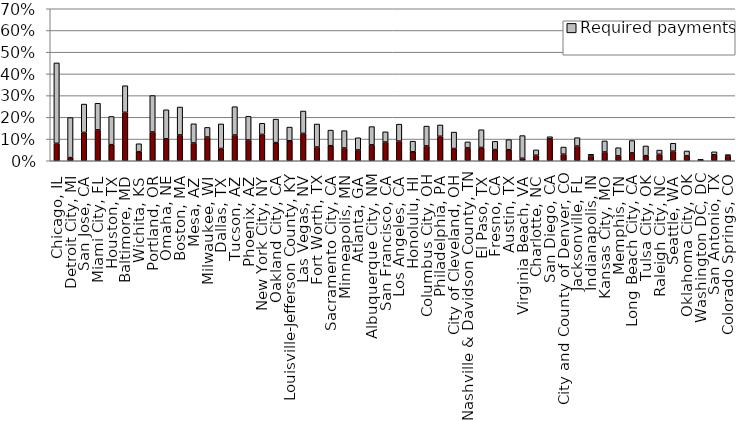
| Category | Current payments | Required payments |
|---|---|---|
| Chicago, IL | 0.08 | 0.371 |
| Detroit City, MI | 0.015 | 0.184 |
| San Jose, CA | 0.13 | 0.131 |
| Miami City, FL | 0.142 | 0.123 |
| Houston, TX | 0.074 | 0.13 |
| Baltimore, MD | 0.223 | 0.123 |
| Wichita, KS | 0.042 | 0.036 |
| Portland, OR | 0.132 | 0.168 |
| Omaha, NE | 0.101 | 0.134 |
| Boston, MA | 0.119 | 0.129 |
| Mesa, AZ | 0.082 | 0.088 |
| Milwaukee, WI | 0.109 | 0.044 |
| Dallas, TX | 0.056 | 0.113 |
| Tucson, AZ | 0.118 | 0.13 |
| Phoenix, AZ | 0.096 | 0.109 |
| New York City, NY | 0.121 | 0.051 |
| Oakland City, CA | 0.084 | 0.108 |
| Louisville-Jefferson County, KY | 0.092 | 0.063 |
| Las Vegas, NV | 0.126 | 0.103 |
| Fort Worth, TX | 0.063 | 0.106 |
| Sacramento City, CA | 0.069 | 0.072 |
| Minneapolis, MN | 0.059 | 0.08 |
| Atlanta, GA | 0.05 | 0.056 |
| Albuquerque City, NM | 0.073 | 0.084 |
| San Francisco, CA | 0.086 | 0.047 |
| Los Angeles, CA | 0.09 | 0.078 |
| Honolulu, HI | 0.041 | 0.049 |
| Columbus City, OH | 0.068 | 0.091 |
| Philadelphia, PA | 0.113 | 0.052 |
| City of Cleveland, OH | 0.056 | 0.076 |
| Nashville & Davidson County, TN | 0.059 | 0.028 |
| El Paso, TX | 0.061 | 0.082 |
| Fresno, CA | 0.052 | 0.038 |
| Austin, TX | 0.051 | 0.046 |
| Virginia Beach, VA | 0.011 | 0.105 |
| Charlotte, NC | 0.025 | 0.025 |
| San Diego, CA | 0.101 | 0.01 |
| City and County of Denver, CO | 0.03 | 0.033 |
| Jacksonville, FL | 0.068 | 0.039 |
| Indianapolis, IN | 0.022 | 0.008 |
| Kansas City, MO | 0.04 | 0.051 |
| Memphis, TN | 0.022 | 0.038 |
| Long Beach City, CA | 0.036 | 0.057 |
| Tulsa City, OK | 0.024 | 0.044 |
| Raleigh City, NC | 0.03 | 0.02 |
| Seattle, WA | 0.044 | 0.037 |
| Oklahoma City, OK | 0.023 | 0.023 |
| Washington DC, DC | 0.006 | 0 |
| San Antonio, TX | 0.027 | 0.014 |
| Colorado Springs, CO | 0.022 | 0.006 |